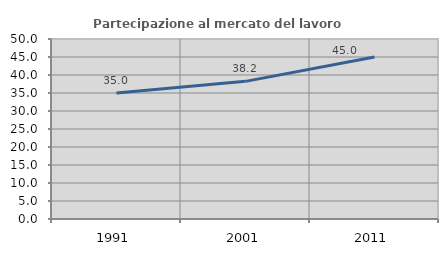
| Category | Partecipazione al mercato del lavoro  femminile |
|---|---|
| 1991.0 | 34.995 |
| 2001.0 | 38.234 |
| 2011.0 | 44.983 |